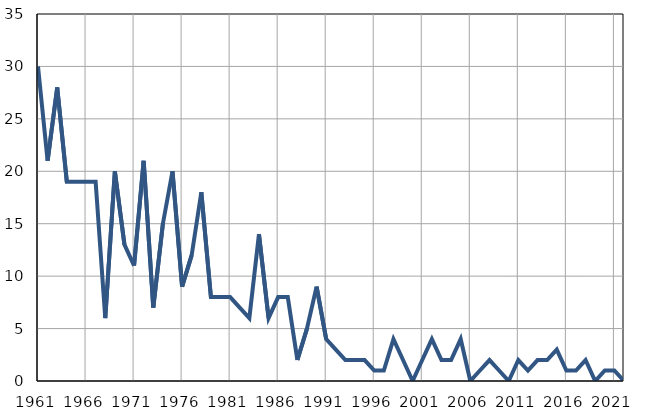
| Category | Infants
deaths |
|---|---|
| 1961.0 | 30 |
| 1962.0 | 21 |
| 1963.0 | 28 |
| 1964.0 | 19 |
| 1965.0 | 19 |
| 1966.0 | 19 |
| 1967.0 | 19 |
| 1968.0 | 6 |
| 1969.0 | 20 |
| 1970.0 | 13 |
| 1971.0 | 11 |
| 1972.0 | 21 |
| 1973.0 | 7 |
| 1974.0 | 15 |
| 1975.0 | 20 |
| 1976.0 | 9 |
| 1977.0 | 12 |
| 1978.0 | 18 |
| 1979.0 | 8 |
| 1980.0 | 8 |
| 1981.0 | 8 |
| 1982.0 | 7 |
| 1983.0 | 6 |
| 1984.0 | 14 |
| 1985.0 | 6 |
| 1986.0 | 8 |
| 1987.0 | 8 |
| 1988.0 | 2 |
| 1989.0 | 5 |
| 1990.0 | 9 |
| 1991.0 | 4 |
| 1992.0 | 3 |
| 1993.0 | 2 |
| 1994.0 | 2 |
| 1995.0 | 2 |
| 1996.0 | 1 |
| 1997.0 | 1 |
| 1998.0 | 4 |
| 1999.0 | 2 |
| 2000.0 | 0 |
| 2001.0 | 2 |
| 2002.0 | 4 |
| 2003.0 | 2 |
| 2004.0 | 2 |
| 2005.0 | 4 |
| 2006.0 | 0 |
| 2007.0 | 1 |
| 2008.0 | 2 |
| 2009.0 | 1 |
| 2010.0 | 0 |
| 2011.0 | 2 |
| 2012.0 | 1 |
| 2013.0 | 2 |
| 2014.0 | 2 |
| 2015.0 | 3 |
| 2016.0 | 1 |
| 2017.0 | 1 |
| 2018.0 | 2 |
| 2019.0 | 0 |
| 2020.0 | 1 |
| 2021.0 | 1 |
| 2022.0 | 0 |